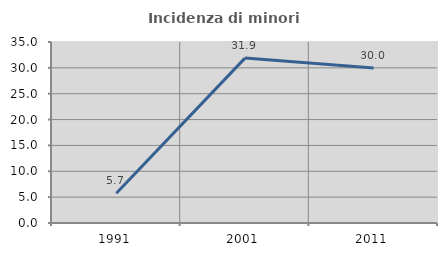
| Category | Incidenza di minori stranieri |
|---|---|
| 1991.0 | 5.747 |
| 2001.0 | 31.888 |
| 2011.0 | 29.98 |